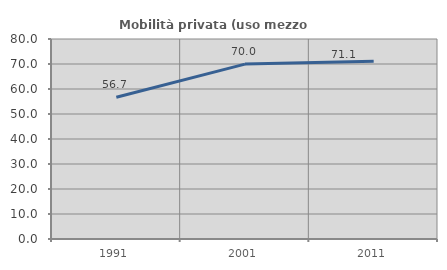
| Category | Mobilità privata (uso mezzo privato) |
|---|---|
| 1991.0 | 56.7 |
| 2001.0 | 69.967 |
| 2011.0 | 71.107 |